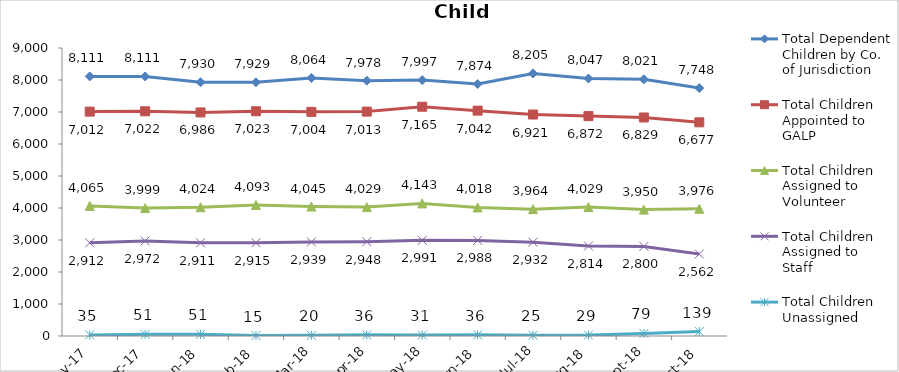
| Category | Total Dependent Children by Co. of Jurisdiction | Total Children Appointed to GALP | Total Children Assigned to Volunteer | Total Children Assigned to Staff | Total Children Unassigned |
|---|---|---|---|---|---|
| 2017-11-01 | 8111 | 7012 | 4065 | 2912 | 35 |
| 2017-12-01 | 8111 | 7022 | 3999 | 2972 | 51 |
| 2018-01-01 | 7930 | 6986 | 4024 | 2911 | 51 |
| 2018-02-01 | 7929 | 7023 | 4093 | 2915 | 15 |
| 2018-03-01 | 8064 | 7004 | 4045 | 2939 | 20 |
| 2018-04-01 | 7978 | 7013 | 4029 | 2948 | 36 |
| 2018-05-01 | 7997 | 7165 | 4143 | 2991 | 31 |
| 2018-06-01 | 7874 | 7042 | 4018 | 2988 | 36 |
| 2018-07-01 | 8205 | 6921 | 3964 | 2932 | 25 |
| 2018-08-01 | 8047 | 6872 | 4029 | 2814 | 29 |
| 2018-09-01 | 8021 | 6829 | 3950 | 2800 | 79 |
| 2018-10-01 | 7748 | 6677 | 3976 | 2562 | 139 |